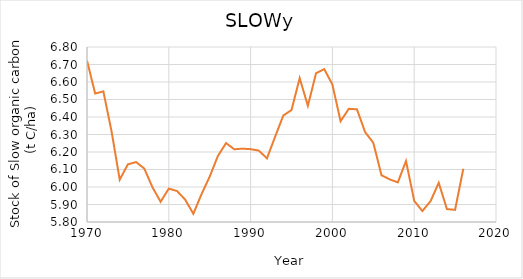
| Category | Series 0 |
|---|---|
| 1970.0 | 6.722 |
| 1971.0 | 6.534 |
| 1972.0 | 6.546 |
| 1973.0 | 6.318 |
| 1974.0 | 6.042 |
| 1975.0 | 6.129 |
| 1976.0 | 6.142 |
| 1977.0 | 6.106 |
| 1978.0 | 5.999 |
| 1979.0 | 5.916 |
| 1980.0 | 5.991 |
| 1981.0 | 5.977 |
| 1982.0 | 5.928 |
| 1983.0 | 5.847 |
| 1984.0 | 5.959 |
| 1985.0 | 6.059 |
| 1986.0 | 6.177 |
| 1987.0 | 6.251 |
| 1988.0 | 6.216 |
| 1989.0 | 6.219 |
| 1990.0 | 6.216 |
| 1991.0 | 6.208 |
| 1992.0 | 6.164 |
| 1993.0 | 6.288 |
| 1994.0 | 6.409 |
| 1995.0 | 6.44 |
| 1996.0 | 6.622 |
| 1997.0 | 6.464 |
| 1998.0 | 6.65 |
| 1999.0 | 6.674 |
| 2000.0 | 6.586 |
| 2001.0 | 6.376 |
| 2002.0 | 6.447 |
| 2003.0 | 6.444 |
| 2004.0 | 6.314 |
| 2005.0 | 6.253 |
| 2006.0 | 6.067 |
| 2007.0 | 6.044 |
| 2008.0 | 6.027 |
| 2009.0 | 6.148 |
| 2010.0 | 5.921 |
| 2011.0 | 5.863 |
| 2012.0 | 5.919 |
| 2013.0 | 6.024 |
| 2014.0 | 5.874 |
| 2015.0 | 5.869 |
| 2016.0 | 6.104 |